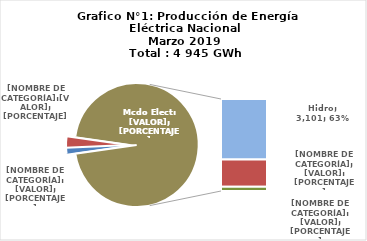
| Category | Series 0 |
|---|---|
| 0 | 75.652 |
| 1 | 146.854 |
| 2 | 3101.074 |
| 3 | 1399.998 |
| 4 | 221.003 |